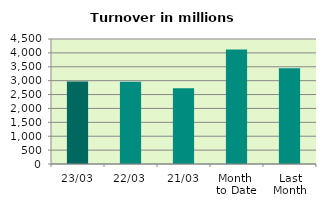
| Category | Series 0 |
|---|---|
| 23/03 | 2973.051 |
| 22/03 | 2962.478 |
| 21/03 | 2725.054 |
| Month 
to Date | 4120.225 |
| Last
Month | 3445.759 |